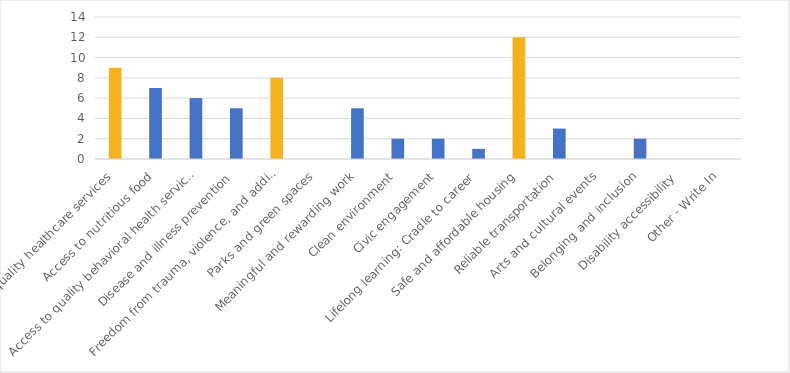
| Category | Number of Responses |
|---|---|
| Access to quality healthcare services | 9 |
| Access to nutritious food | 7 |
| Access to quality behavioral health services | 6 |
| Disease and illness prevention | 5 |
| Freedom from trauma, violence, and addiction | 8 |
| Parks and green spaces | 0 |
| Meaningful and rewarding work | 5 |
| Clean environment | 2 |
| Civic engagement | 2 |
| Lifelong learning: Cradle to career | 1 |
| Safe and affordable housing | 12 |
| Reliable transportation | 3 |
| Arts and cultural events | 0 |
| Belonging and inclusion | 2 |
| Disability accessibility | 0 |
| Other - Write In | 0 |